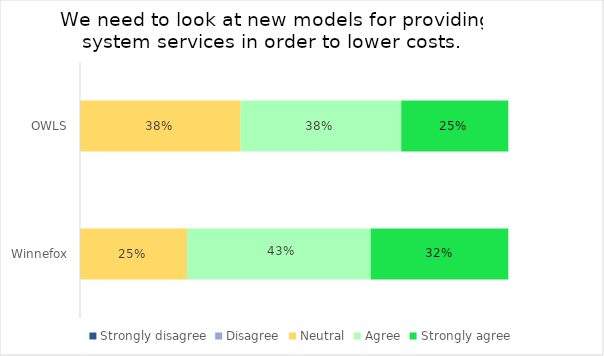
| Category | Strongly disagree | Disagree | Neutral | Agree | Strongly agree |
|---|---|---|---|---|---|
| OWLS | 0 | 0 | 0.375 | 0.375 | 0.25 |
| Winnefox | 0 | 0 | 0.25 | 0.429 | 0.321 |